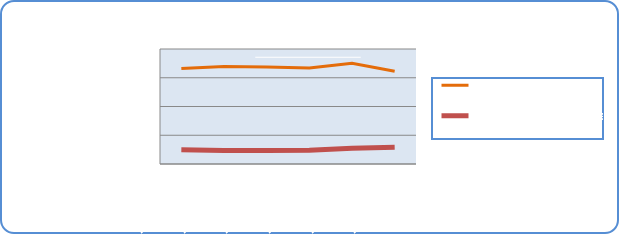
| Category | Motorin Türleri | Benzin Türleri |
|---|---|---|
| 7/22/19 | 66365680.912 | 9898120.592 |
| 7/23/19 | 67774750.637 | 9446988.195 |
| 7/24/19 | 67429499.964 | 9354296.429 |
| 7/25/19 | 66749376.046 | 9618280.789 |
| 7/26/19 | 69995631.358 | 10955481.141 |
| 7/27/19 | 64546438.845 | 11602587.632 |